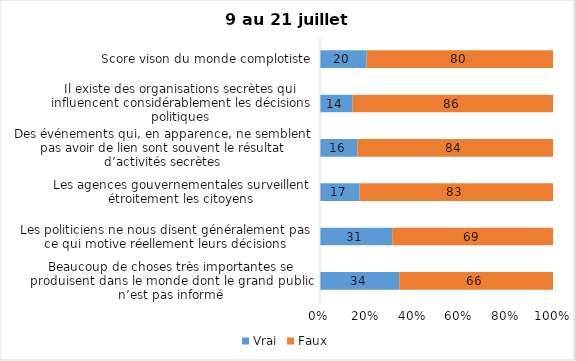
| Category | Vrai | Faux |
|---|---|---|
| Beaucoup de choses très importantes se produisent dans le monde dont le grand public n’est pas informé | 34 | 66 |
| Les politiciens ne nous disent généralement pas ce qui motive réellement leurs décisions | 31 | 69 |
| Les agences gouvernementales surveillent étroitement les citoyens | 17 | 83 |
| Des événements qui, en apparence, ne semblent pas avoir de lien sont souvent le résultat d’activités secrètes | 16 | 84 |
| Il existe des organisations secrètes qui influencent considérablement les décisions politiques | 14 | 86 |
| Score vison du monde complotiste | 20 | 80 |